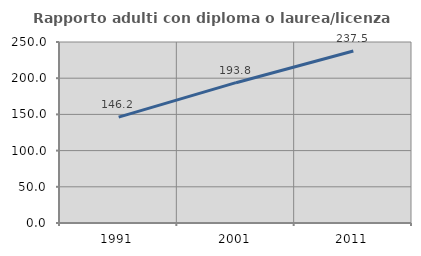
| Category | Rapporto adulti con diploma o laurea/licenza media  |
|---|---|
| 1991.0 | 146.22 |
| 2001.0 | 193.812 |
| 2011.0 | 237.535 |